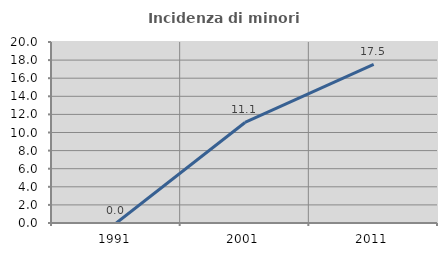
| Category | Incidenza di minori stranieri |
|---|---|
| 1991.0 | 0 |
| 2001.0 | 11.111 |
| 2011.0 | 17.526 |